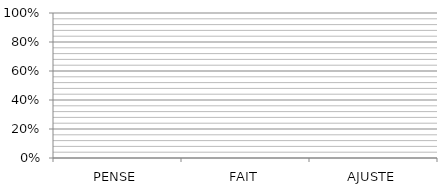
| Category | Series 0 | Series 1 | Series 2 | Series 3 | Series 4 | Series 5 | Series 6 | Series 7 |
|---|---|---|---|---|---|---|---|---|
| PENSE | 0 | 0 | 0 | 0 | 0 | 0 | 0 | 0 |
| FAIT | 0 | 0 | 0 | 0 | 0 | 0 | 0 | 0 |
| AJUSTE | 0 | 0 | 0 | 0 | 0 | 0 | 0 | 0 |